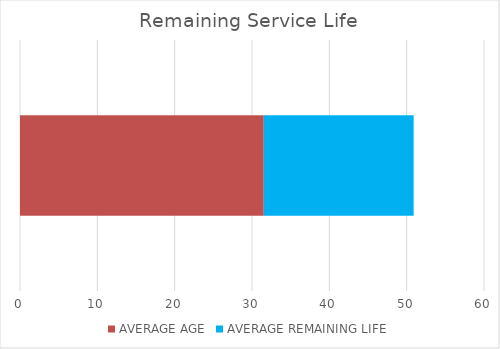
| Category | AVERAGE AGE | AVERAGE REMAINING LIFE |
|---|---|---|
| BACKLOG % OF TOTAL ASSET VALUE | 31.523 | 19.379 |